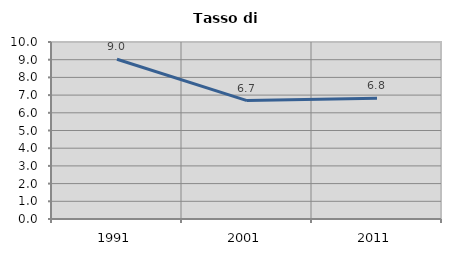
| Category | Tasso di disoccupazione   |
|---|---|
| 1991.0 | 9.023 |
| 2001.0 | 6.688 |
| 2011.0 | 6.826 |